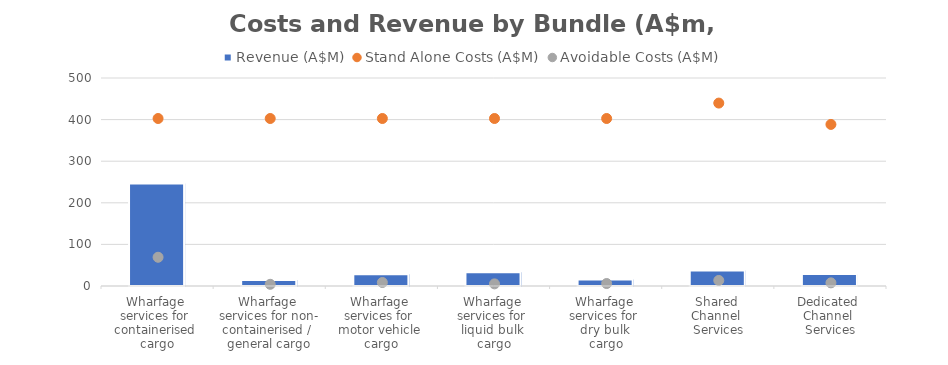
| Category |  Revenue (A$M)  |
|---|---|
| Wharfage 
services for 
containerised 
cargo | 246.496 |
| Wharfage 
services for non-
containerised / 
general cargo | 14.573 |
| Wharfage 
services for 
motor vehicle 
cargo | 28.277 |
| Wharfage 
services for 
liquid bulk 
cargo | 32.849 |
| Wharfage 
services for 
dry bulk 
cargo | 15.887 |
| Shared 
Channel 
Services | 37.536 |
| Dedicated 
Channel 
Services | 28.904 |